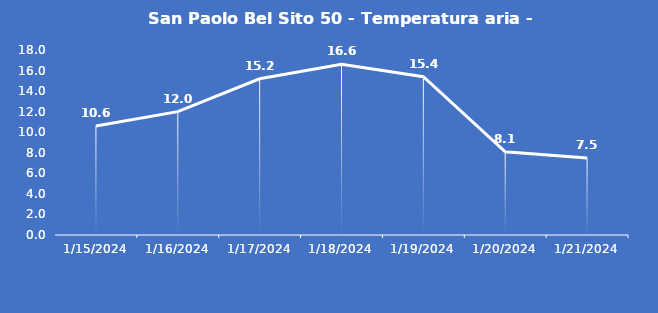
| Category | San Paolo Bel Sito 50 - Temperatura aria - Grezzo (°C) |
|---|---|
| 1/15/24 | 10.6 |
| 1/16/24 | 12 |
| 1/17/24 | 15.2 |
| 1/18/24 | 16.6 |
| 1/19/24 | 15.4 |
| 1/20/24 | 8.1 |
| 1/21/24 | 7.5 |